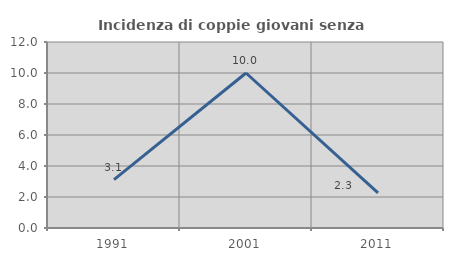
| Category | Incidenza di coppie giovani senza figli |
|---|---|
| 1991.0 | 3.125 |
| 2001.0 | 10 |
| 2011.0 | 2.273 |